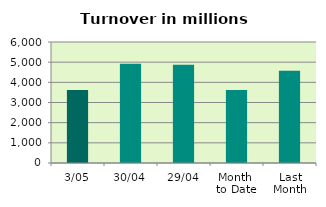
| Category | Series 0 |
|---|---|
| 3/05 | 3625.082 |
| 30/04 | 4927.224 |
| 29/04 | 4868.905 |
| Month 
to Date | 3625.082 |
| Last
Month | 4573.802 |